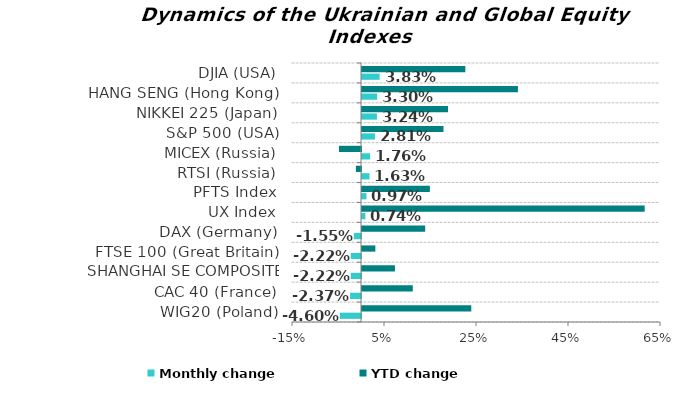
| Category | Monthly change | YTD change |
|---|---|---|
| WIG20 (Poland) | -0.046 | 0.238 |
| CAC 40 (France) | -0.024 | 0.11 |
| SHANGHAI SE COMPOSITE (China) | -0.022 | 0.072 |
| FTSE 100 (Great Britain) | -0.022 | 0.029 |
| DAX (Germany) | -0.016 | 0.137 |
| UX Index | 0.007 | 0.615 |
| PFTS Index | 0.01 | 0.148 |
| RTSI (Russia) | 0.016 | -0.011 |
| MICEX (Russia) | 0.018 | -0.048 |
| S&P 500 (USA) | 0.028 | 0.177 |
| NIKKEI 225 (Japan) | 0.032 | 0.187 |
| HANG SENG (Hong Kong) | 0.033 | 0.339 |
| DJIA (USA) | 0.038 | 0.225 |